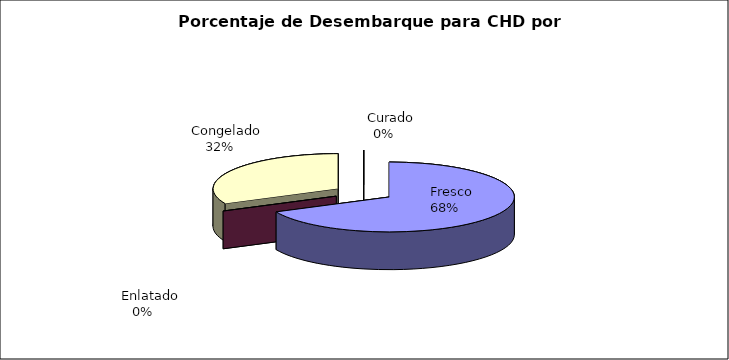
| Category | Series 0 |
|---|---|
|     Fresco | 8944.88 |
|     Enlatado | 0 |
|     Congelado | 4212.62 |
|     Curado | 0 |